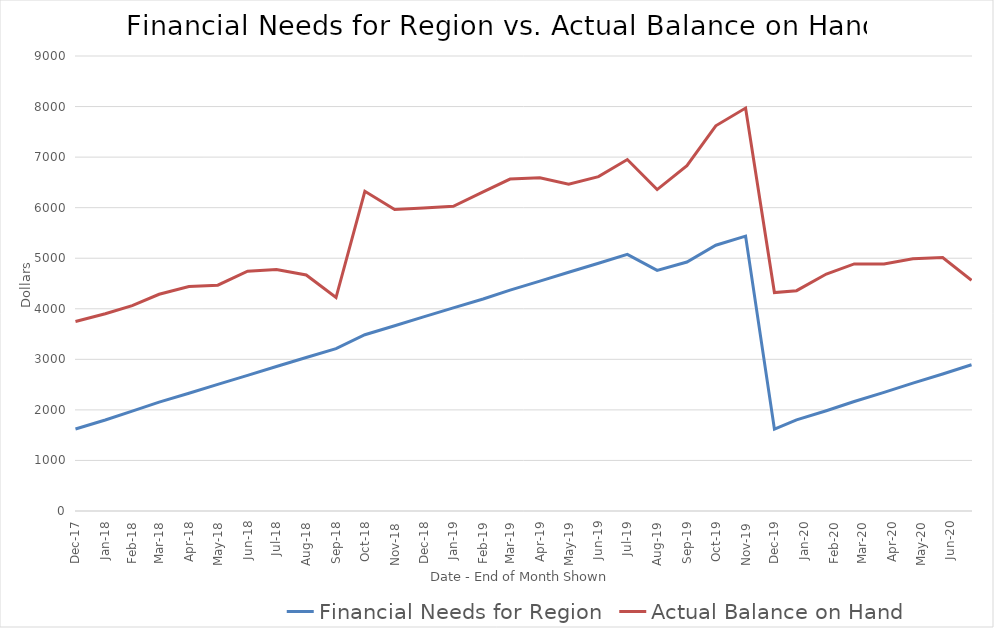
| Category | Financial Needs for Region | Actual Balance on Hand |
|---|---|---|
| 2017-12-31 | 1622.5 | 3749 |
| 2018-01-31 | 1799.167 | 3901 |
| 2018-02-28 | 1975.833 | 4061 |
| 2018-03-28 | 2152.5 | 4287 |
| 2018-04-28 | 2329.167 | 4441 |
| 2018-05-28 | 2505.833 | 4466 |
| 2018-06-28 | 2682.5 | 4742 |
| 2018-07-28 | 2859.167 | 4777 |
| 2018-08-28 | 3035.833 | 4668 |
| 2018-09-28 | 3212.5 | 4222 |
| 2018-10-28 | 3486.667 | 6325 |
| 2018-11-28 | 3663.333 | 5965 |
| 2018-12-28 | 3840 | 5991 |
| 2019-01-28 | 4016.667 | 6026 |
| 2019-02-28 | 4193.333 | 6313 |
| 2019-03-28 | 4370 | 6566 |
| 2019-04-28 | 4546.667 | 6591 |
| 2019-05-28 | 4723.333 | 6463 |
| 2019-06-28 | 4900 | 6614 |
| 2019-07-28 | 5076.667 | 6952 |
| 2019-08-28 | 4758.333 | 6358 |
| 2019-09-28 | 4925 | 6832 |
| 2019-10-28 | 5257 | 7620 |
| 2019-11-28 | 5438 | 7970 |
| 2019-12-28 | 1620 | 4320 |
| 2020-01-20 | 1802.5 | 4358 |
| 2020-02-20 | 1983.5 | 4688 |
| 2020-03-20 | 2165.5 | 4888 |
| 2020-04-20 | 2347.5 | 4888 |
| 2020-05-20 | 2528.5 | 4988 |
| 2020-06-20 | 2710.5 | 5013 |
| 2020-07-20 | 2892.5 | 4563 |